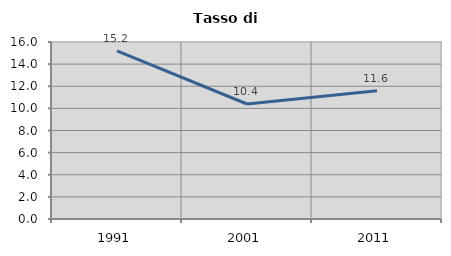
| Category | Tasso di disoccupazione   |
|---|---|
| 1991.0 | 15.191 |
| 2001.0 | 10.395 |
| 2011.0 | 11.599 |